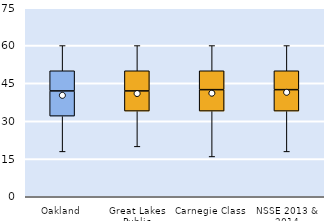
| Category | 25th | 50th | 75th |
|---|---|---|---|
| Oakland | 32 | 10 | 8 |
| Great Lakes Public | 34 | 8 | 8 |
| Carnegie Class | 34 | 8.5 | 7.5 |
| NSSE 2013 & 2014 | 34 | 8.5 | 7.5 |